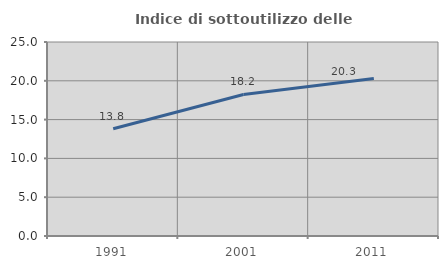
| Category | Indice di sottoutilizzo delle abitazioni  |
|---|---|
| 1991.0 | 13.823 |
| 2001.0 | 18.236 |
| 2011.0 | 20.311 |